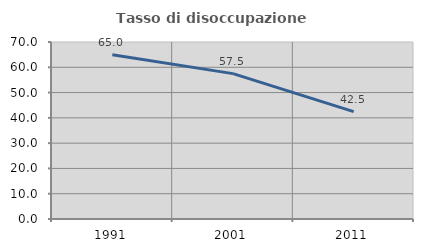
| Category | Tasso di disoccupazione giovanile  |
|---|---|
| 1991.0 | 64.957 |
| 2001.0 | 57.498 |
| 2011.0 | 42.475 |